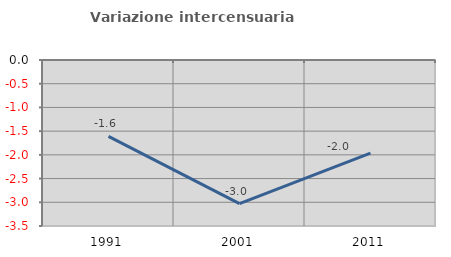
| Category | Variazione intercensuaria annua |
|---|---|
| 1991.0 | -1.612 |
| 2001.0 | -3.028 |
| 2011.0 | -1.965 |